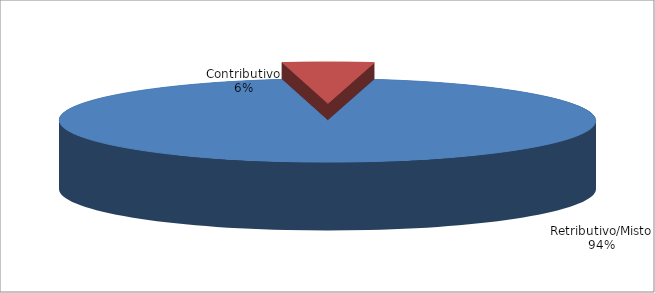
| Category | Series 1 |
|---|---|
| Retributivo/Misto | 62019 |
| Contributivo | 3616 |